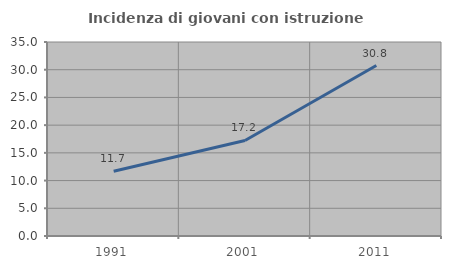
| Category | Incidenza di giovani con istruzione universitaria |
|---|---|
| 1991.0 | 11.692 |
| 2001.0 | 17.24 |
| 2011.0 | 30.759 |